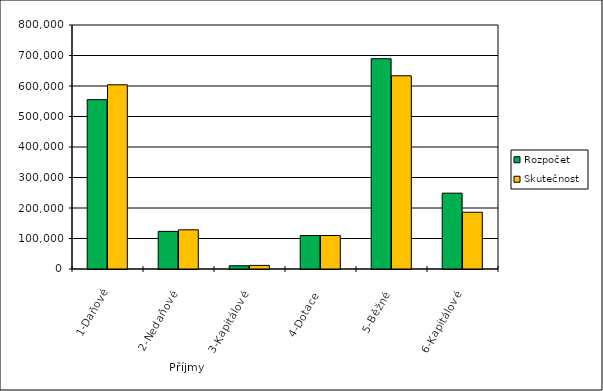
| Category | Rozpočet | Skutečnost |
|---|---|---|
| 1-Daňové | 555150 | 603970.889 |
| 2-Nedaňové | 123398.874 | 128439.425 |
| 3-Kapitálové | 10560.348 | 11793.307 |
| 4-Dotace | 109618.212 | 109740.212 |
| 5-Běžné | 689494.449 | 633512.062 |
| 6-Kapitálové | 248650.427 | 186113.661 |